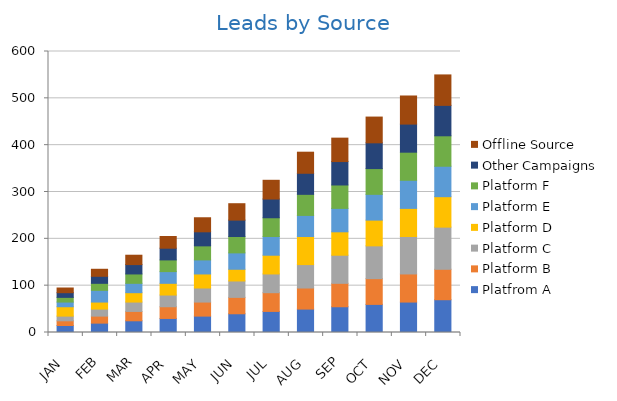
| Category | Platfrom A | Platform B | Platform C | Platform D | Platform E | Platform F | Other Campaigns | Offline Source |
|---|---|---|---|---|---|---|---|---|
| JAN | 15 | 10 | 10 | 20 | 10 | 10 | 10 | 10 |
| FEB | 20 | 15 | 15 | 15 | 25 | 15 | 15 | 15 |
| MAR | 25 | 20 | 20 | 20 | 20 | 20 | 20 | 20 |
| APR | 30 | 25 | 25 | 25 | 25 | 25 | 25 | 25 |
| MAY | 35 | 30 | 30 | 30 | 30 | 30 | 30 | 30 |
| JUN | 40 | 35 | 35 | 25 | 35 | 35 | 35 | 35 |
| JUL | 45 | 40 | 40 | 40 | 40 | 40 | 40 | 40 |
| AUG | 50 | 45 | 50 | 60 | 45 | 45 | 45 | 45 |
| SEP | 55 | 50 | 60 | 50 | 50 | 50 | 50 | 50 |
| OCT | 60 | 55 | 70 | 55 | 55 | 55 | 55 | 55 |
| NOV | 65 | 60 | 80 | 60 | 60 | 60 | 60 | 60 |
| DEC | 70 | 65 | 90 | 65 | 65 | 65 | 65 | 65 |